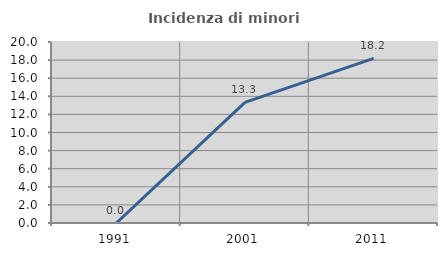
| Category | Incidenza di minori stranieri |
|---|---|
| 1991.0 | 0 |
| 2001.0 | 13.333 |
| 2011.0 | 18.182 |